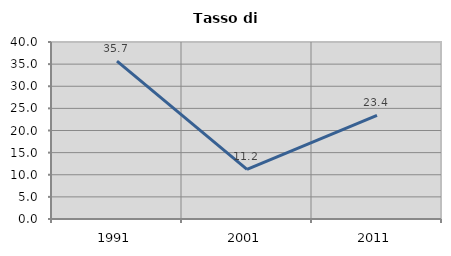
| Category | Tasso di disoccupazione   |
|---|---|
| 1991.0 | 35.666 |
| 2001.0 | 11.217 |
| 2011.0 | 23.408 |